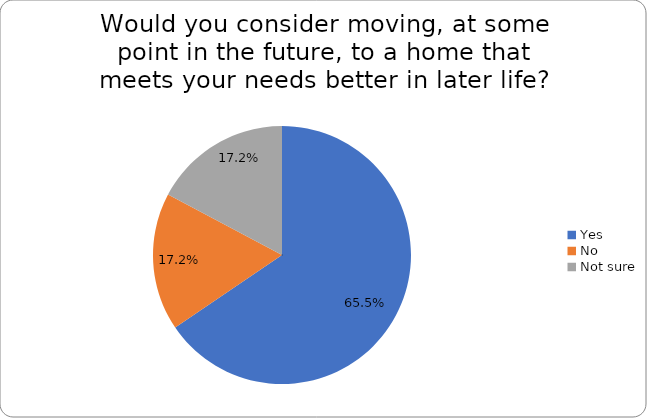
| Category | Series 0 |
|---|---|
| Yes | 0.655 |
| No | 0.172 |
| Not sure | 0.172 |